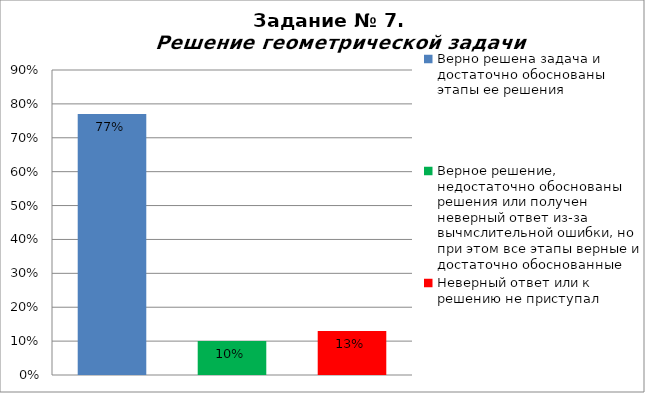
| Category | Решение геометрической задачи  |
|---|---|
| Верно решена задача и достаточно обоснованы этапы ее решения | 0.77 |
| Верное решение, недостаточно обоснованы решения или получен неверный ответ из-за вычмслительной ошибки, но при этом все этапы верные и достаточно обоснованные | 0.1 |
| Неверный ответ или к решению не приступал | 0.13 |